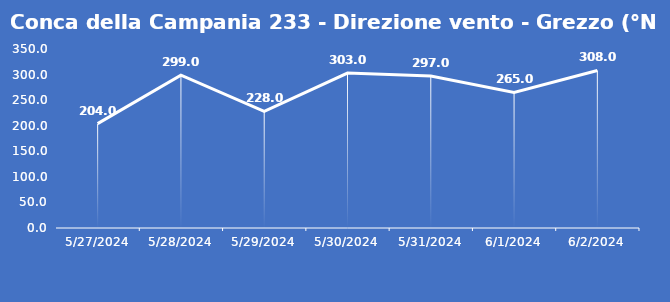
| Category | Conca della Campania 233 - Direzione vento - Grezzo (°N) |
|---|---|
| 5/27/24 | 204 |
| 5/28/24 | 299 |
| 5/29/24 | 228 |
| 5/30/24 | 303 |
| 5/31/24 | 297 |
| 6/1/24 | 265 |
| 6/2/24 | 308 |